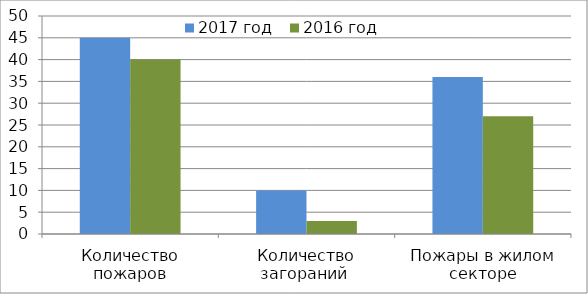
| Category | 2017 год | 2016 год |
|---|---|---|
| Количество пожаров | 45 | 40 |
| Количество загораний  | 10 | 3 |
| Пожары в жилом секторе | 36 | 27 |